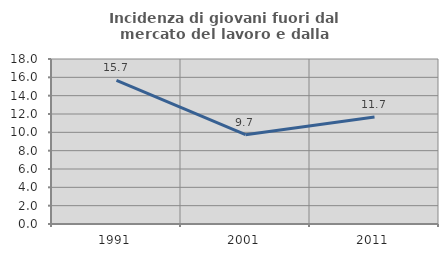
| Category | Incidenza di giovani fuori dal mercato del lavoro e dalla formazione  |
|---|---|
| 1991.0 | 15.657 |
| 2001.0 | 9.74 |
| 2011.0 | 11.679 |